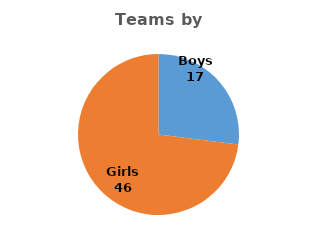
| Category | Teams |
|---|---|
| Boys | 17 |
| Girls | 46 |
| Co-ed | 0 |